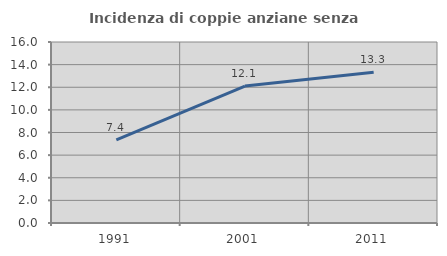
| Category | Incidenza di coppie anziane senza figli  |
|---|---|
| 1991.0 | 7.358 |
| 2001.0 | 12.101 |
| 2011.0 | 13.333 |